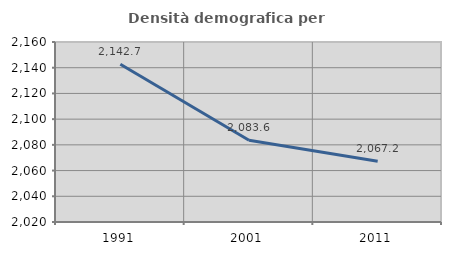
| Category | Densità demografica |
|---|---|
| 1991.0 | 2142.699 |
| 2001.0 | 2083.643 |
| 2011.0 | 2067.172 |